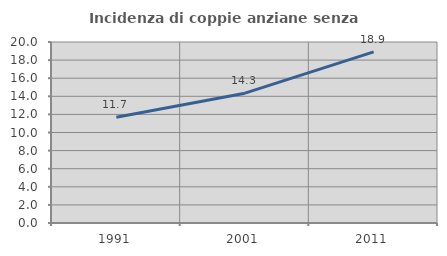
| Category | Incidenza di coppie anziane senza figli  |
|---|---|
| 1991.0 | 11.687 |
| 2001.0 | 14.344 |
| 2011.0 | 18.904 |